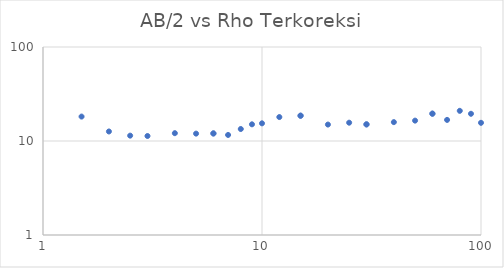
| Category | Series 0 |
|---|---|
| 1.5 | 18.191 |
| 2.0 | 12.627 |
| 2.5 | 11.401 |
| 3.0 | 11.303 |
| 4.0 | 12.113 |
| 5.0 | 11.98 |
| 6.0 | 12.034 |
| 6.0 | 12.034 |
| 7.0 | 11.598 |
| 8.0 | 13.415 |
| 9.0 | 15.048 |
| 10.0 | 15.416 |
| 12.0 | 17.978 |
| 15.0 | 18.593 |
| 15.0 | 18.593 |
| 20.0 | 14.96 |
| 25.0 | 15.658 |
| 30.0 | 15.026 |
| 30.0 | 15.026 |
| 40.0 | 15.877 |
| 50.0 | 16.47 |
| 60.0 | 19.542 |
| 60.0 | 19.542 |
| 70.0 | 16.771 |
| 80.0 | 20.935 |
| 90.0 | 19.482 |
| 100.0 | 15.613 |